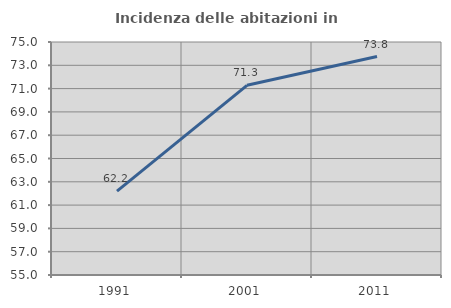
| Category | Incidenza delle abitazioni in proprietà  |
|---|---|
| 1991.0 | 62.201 |
| 2001.0 | 71.28 |
| 2011.0 | 73.754 |